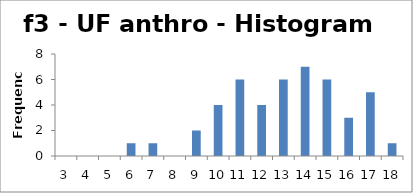
| Category | Frequency |
|---|---|
| 3.0 | 0 |
| 4.0 | 0 |
| 5.0 | 0 |
| 6.0 | 1 |
| 7.0 | 1 |
| 8.0 | 0 |
| 9.0 | 2 |
| 10.0 | 4 |
| 11.0 | 6 |
| 12.0 | 4 |
| 13.0 | 6 |
| 14.0 | 7 |
| 15.0 | 6 |
| 16.0 | 3 |
| 17.0 | 5 |
| 18.0 | 1 |